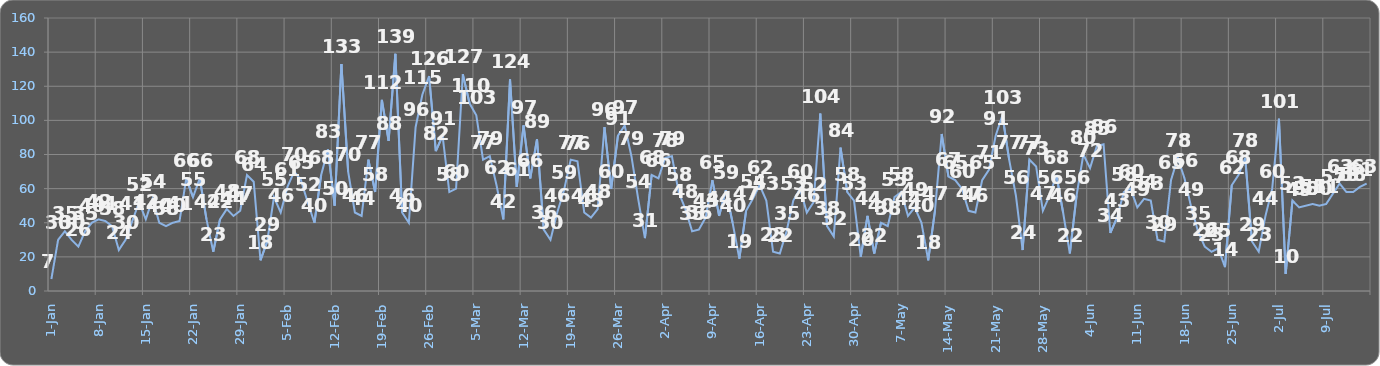
| Category | Dati |
|---|---|
| 2014-01-01 | 7 |
| 2014-01-02 | 30 |
| 2014-01-03 | 35 |
| 2014-01-04 | 30 |
| 2014-01-05 | 26 |
| 2014-01-06 | 35 |
| 2014-01-07 | 40 |
| 2014-01-08 | 42 |
| 2014-01-09 | 41 |
| 2014-01-10 | 38 |
| 2014-01-11 | 24 |
| 2014-01-12 | 30 |
| 2014-01-13 | 41 |
| 2014-01-14 | 52 |
| 2014-01-15 | 42 |
| 2014-01-16 | 54 |
| 2014-01-17 | 40 |
| 2014-01-18 | 38 |
| 2014-01-19 | 40 |
| 2014-01-20 | 41 |
| 2014-01-21 | 66 |
| 2014-01-22 | 55 |
| 2014-01-23 | 66 |
| 2014-01-24 | 42 |
| 2014-01-25 | 23 |
| 2014-01-26 | 42 |
| 2014-01-27 | 48 |
| 2014-01-28 | 44 |
| 2014-01-29 | 47 |
| 2014-01-30 | 68 |
| 2014-01-31 | 64 |
| 2014-02-01 | 18 |
| 2014-02-02 | 29 |
| 2014-02-03 | 55 |
| 2014-02-04 | 46 |
| 2014-02-05 | 61 |
| 2014-02-06 | 70 |
| 2014-02-07 | 65 |
| 2014-02-08 | 52 |
| 2014-02-09 | 40 |
| 2014-02-10 | 68 |
| 2014-02-11 | 83 |
| 2014-02-12 | 50 |
| 2014-02-13 | 133 |
| 2014-02-14 | 70 |
| 2014-02-15 | 46 |
| 2014-02-16 | 44 |
| 2014-02-17 | 77 |
| 2014-02-18 | 58 |
| 2014-02-19 | 112 |
| 2014-02-20 | 88 |
| 2014-02-21 | 139 |
| 2014-02-22 | 46 |
| 2014-02-23 | 40 |
| 2014-02-24 | 96 |
| 2014-02-25 | 115 |
| 2014-02-26 | 126 |
| 2014-02-27 | 82 |
| 2014-02-28 | 91 |
| 2014-03-01 | 58 |
| 2014-03-02 | 60 |
| 2014-03-03 | 127 |
| 2014-03-04 | 110 |
| 2014-03-05 | 103 |
| 2014-03-06 | 77 |
| 2014-03-07 | 79 |
| 2014-03-08 | 62 |
| 2014-03-09 | 42 |
| 2014-03-10 | 124 |
| 2014-03-11 | 61 |
| 2014-03-12 | 97 |
| 2014-03-13 | 66 |
| 2014-03-14 | 89 |
| 2014-03-15 | 36 |
| 2014-03-16 | 30 |
| 2014-03-17 | 46 |
| 2014-03-18 | 59 |
| 2014-03-19 | 77 |
| 2014-03-20 | 76 |
| 2014-03-21 | 46 |
| 2014-03-22 | 43 |
| 2014-03-23 | 48 |
| 2014-03-24 | 96 |
| 2014-03-25 | 60 |
| 2014-03-26 | 91 |
| 2014-03-27 | 97 |
| 2014-03-28 | 79 |
| 2014-03-29 | 54 |
| 2014-03-30 | 31 |
| 2014-03-31 | 68 |
| 2014-04-01 | 66 |
| 2014-04-02 | 78 |
| 2014-04-03 | 79 |
| 2014-04-04 | 58 |
| 2014-04-05 | 48 |
| 2014-04-06 | 35 |
| 2014-04-07 | 36 |
| 2014-04-08 | 43 |
| 2014-04-09 | 65 |
| 2014-04-10 | 44 |
| 2014-04-11 | 59 |
| 2014-04-12 | 40 |
| 2014-04-13 | 19 |
| 2014-04-14 | 47 |
| 2014-04-15 | 54 |
| 2014-04-16 | 62 |
| 2014-04-17 | 53 |
| 2014-04-18 | 23 |
| 2014-04-19 | 22 |
| 2014-04-20 | 35 |
| 2014-04-21 | 53 |
| 2014-04-22 | 60 |
| 2014-04-23 | 46 |
| 2014-04-24 | 52 |
| 2014-04-25 | 104 |
| 2014-04-26 | 38 |
| 2014-04-27 | 32 |
| 2014-04-28 | 84 |
| 2014-04-29 | 58 |
| 2014-04-30 | 53 |
| 2014-05-01 | 20 |
| 2014-05-02 | 44 |
| 2014-05-03 | 22 |
| 2014-05-04 | 40 |
| 2014-05-05 | 38 |
| 2014-05-06 | 55 |
| 2014-05-07 | 58 |
| 2014-05-08 | 44 |
| 2014-05-09 | 49 |
| 2014-05-10 | 40 |
| 2014-05-11 | 18 |
| 2014-05-12 | 47 |
| 2014-05-13 | 92 |
| 2014-05-14 | 67 |
| 2014-05-15 | 65 |
| 2014-05-16 | 60 |
| 2014-05-17 | 47 |
| 2014-05-18 | 46 |
| 2014-05-19 | 65 |
| 2014-05-20 | 71 |
| 2014-05-21 | 91 |
| 2014-05-22 | 103 |
| 2014-05-23 | 77 |
| 2014-05-24 | 56 |
| 2014-05-25 | 24 |
| 2014-05-26 | 77 |
| 2014-05-27 | 73 |
| 2014-05-28 | 47 |
| 2014-05-29 | 56 |
| 2014-05-30 | 68 |
| 2014-05-31 | 46 |
| 2014-06-01 | 22 |
| 2014-06-02 | 56 |
| 2014-06-03 | 80 |
| 2014-06-04 | 72 |
| 2014-06-05 | 85 |
| 2014-06-06 | 86 |
| 2014-06-07 | 34 |
| 2014-06-08 | 43 |
| 2014-06-09 | 58 |
| 2014-06-10 | 60 |
| 2014-06-11 | 49 |
| 2014-06-12 | 54 |
| 2014-06-13 | 53 |
| 2014-06-14 | 30 |
| 2014-06-15 | 29 |
| 2014-06-16 | 65 |
| 2014-06-17 | 78 |
| 2014-06-18 | 66 |
| 2014-06-19 | 49 |
| 2014-06-20 | 35 |
| 2014-06-21 | 26 |
| 2014-06-22 | 23 |
| 2014-06-23 | 25 |
| 2014-06-24 | 14 |
| 2014-06-25 | 62 |
| 2014-06-26 | 68 |
| 2014-06-27 | 78 |
| 2014-06-28 | 29 |
| 2014-06-29 | 23 |
| 2014-06-30 | 44 |
| 2014-07-01 | 60 |
| 2014-07-02 | 101 |
| 2014-07-03 | 10 |
| 2014-07-04 | 53 |
| 2014-07-05 | 49 |
| 2014-07-06 | 50 |
| 2014-07-07 | 51 |
| 2014-07-08 | 50 |
| 2014-07-09 | 51 |
| 2014-07-10 | 57 |
| 2014-07-11 | 63 |
| 2014-07-12 | 58 |
| 2014-07-13 | 58 |
| 2014-07-14 | 61 |
| 2014-07-15 | 63 |